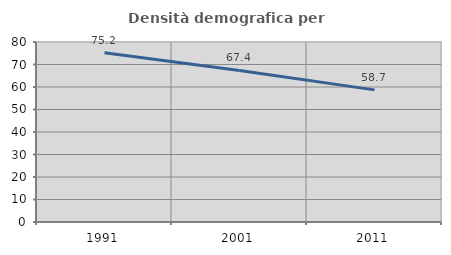
| Category | Densità demografica |
|---|---|
| 1991.0 | 75.226 |
| 2001.0 | 67.363 |
| 2011.0 | 58.721 |